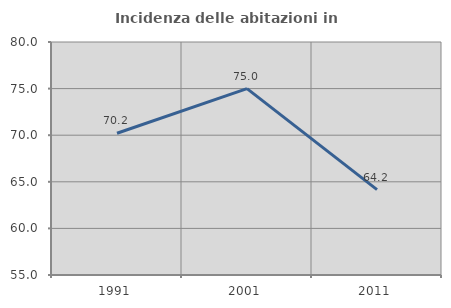
| Category | Incidenza delle abitazioni in proprietà  |
|---|---|
| 1991.0 | 70.213 |
| 2001.0 | 75 |
| 2011.0 | 64.167 |